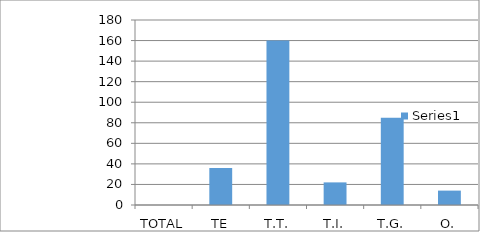
| Category | Series 0 |
|---|---|
| TOTAL | 0 |
| TE | 36 |
| T.T. | 160 |
| T.I. | 22 |
| T.G. | 85 |
| O. | 14 |